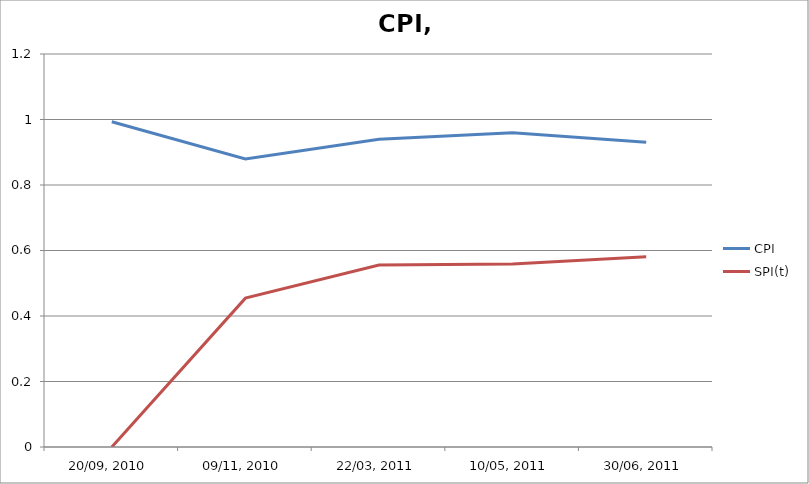
| Category | CPI | SPI(t) |
|---|---|---|
| 20/09, 2010 | 0.993 | 0 |
| 09/11, 2010 | 0.879 | 0.455 |
| 22/03, 2011 | 0.94 | 0.556 |
| 10/05, 2011 | 0.96 | 0.559 |
| 30/06, 2011 | 0.93 | 0.581 |